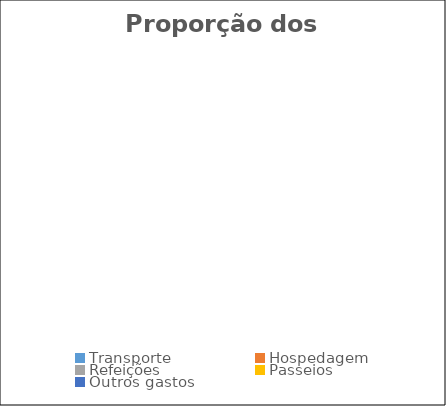
| Category | Series 0 |
|---|---|
| Transporte | 0 |
| Hospedagem | 0 |
| Refeições | 0 |
| Passeios | 0 |
| Outros gastos | 0 |